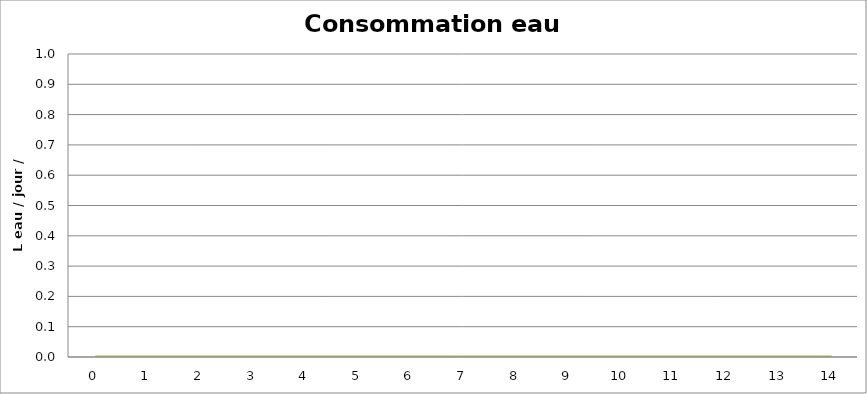
| Category | Eau |
|---|---|
| 0.0 | 0 |
| 1.0 | 0 |
| 2.0 | 0 |
| 3.0 | 0 |
| 4.0 | 0 |
| 5.0 | 0 |
| 6.0 | 0 |
| 7.0 | 0 |
| 8.0 | 0 |
| 9.0 | 0 |
| 10.0 | 0 |
| 11.0 | 0 |
| 12.0 | 0 |
| 13.0 | 0 |
| 14.0 | 0 |